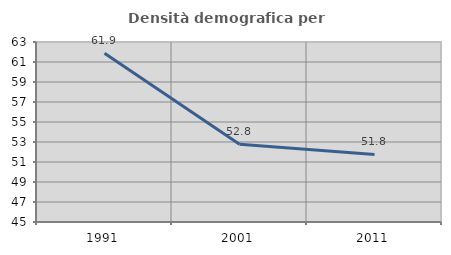
| Category | Densità demografica |
|---|---|
| 1991.0 | 61.878 |
| 2001.0 | 52.769 |
| 2011.0 | 51.754 |